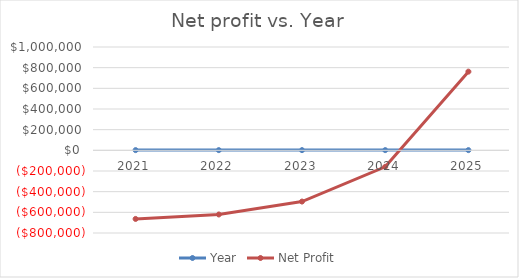
| Category | Year | Net Profit |
|---|---|---|
| 2021.0 | 2021 | -663833.333 |
| 2022.0 | 2022 | -620811.333 |
| 2023.0 | 2023 | -495635.933 |
| 2024.0 | 2024 | -159447.791 |
| 2025.0 | 2025 | 761542.55 |